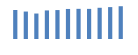
| Category | Exportações (1) |
|---|---|
| 0 | 392293.987 |
| 1 | 370979.678 |
| 2 | 344221.998 |
| 3 | 386156.652 |
| 4 | 390987.572 |
| 5 | 406026.912 |
| 6 | 407591.941 |
| 7 | 406953.169 |
| 8 | 421887.391 |
| 9 | 430937.239 |
| 10 | 442975.948 |